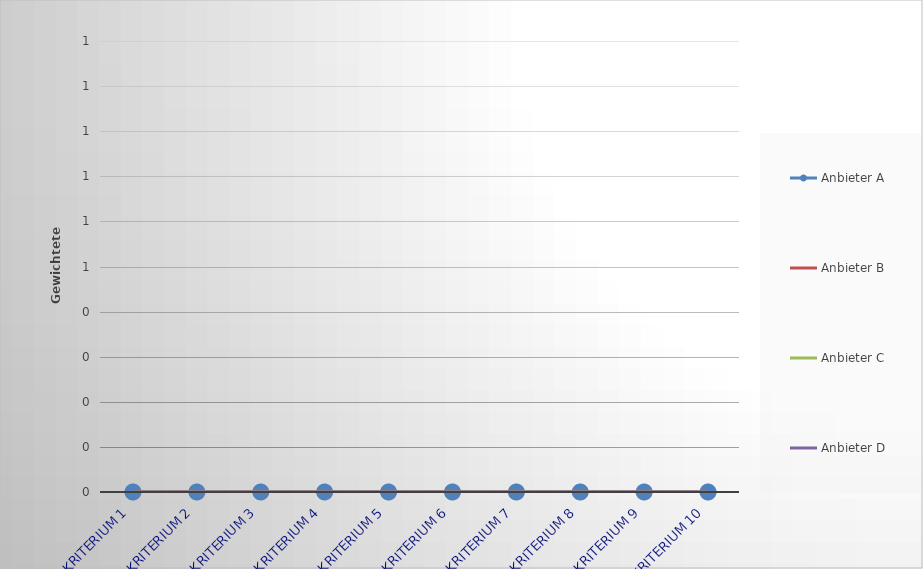
| Category | Anbieter A | Anbieter B | Anbieter C | Anbieter D | Lösung E | Lösung F | Lösung G | Lösung H |
|---|---|---|---|---|---|---|---|---|
| Kriterium 1 | 0 | 0 | 0 | 0 |  |  |  |  |
| Kriterium 2 | 0 | 0 | 0 | 0 |  |  |  |  |
| Kriterium 3 | 0 | 0 | 0 | 0 |  |  |  |  |
| Kriterium 4 | 0 | 0 | 0 | 0 |  |  |  |  |
| Kriterium 5 | 0 | 0 | 0 | 0 |  |  |  |  |
| Kriterium 6 | 0 | 0 | 0 | 0 |  |  |  |  |
| Kriterium 7 | 0 | 0 | 0 | 0 |  |  |  |  |
| Kriterium 8 | 0 | 0 | 0 | 0 |  |  |  |  |
| Kriterium 9 | 0 | 0 | 0 | 0 |  |  |  |  |
| Kriterium 10 | 0 | 0 | 0 | 0 |  |  |  |  |